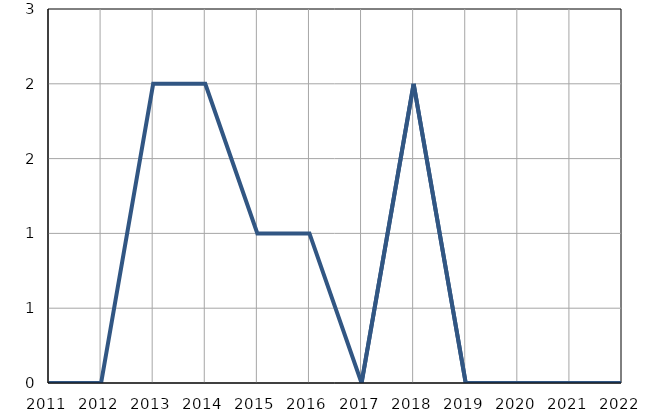
| Category | Умрла 
одојчад |
|---|---|
| 2011.0 | 0 |
| 2012.0 | 0 |
| 2013.0 | 2 |
| 2014.0 | 2 |
| 2015.0 | 1 |
| 2016.0 | 1 |
| 2017.0 | 0 |
| 2018.0 | 2 |
| 2019.0 | 0 |
| 2020.0 | 0 |
| 2021.0 | 0 |
| 2022.0 | 0 |